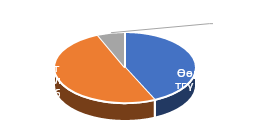
| Category | Total |
|---|---|
| Өөрчлөлтгүй | 116 |
| Түүвэрт хамруулсан | 136 |
| Хязгаарлалттай Өөрчлөлттэй | 17 |